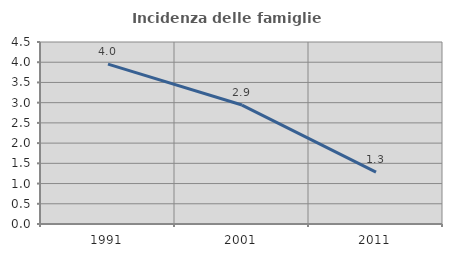
| Category | Incidenza delle famiglie numerose |
|---|---|
| 1991.0 | 3.954 |
| 2001.0 | 2.941 |
| 2011.0 | 1.282 |